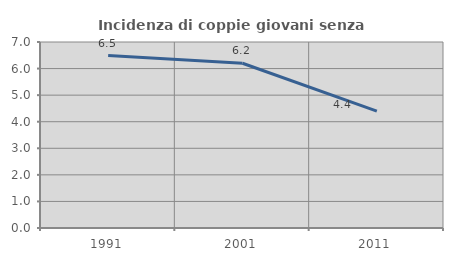
| Category | Incidenza di coppie giovani senza figli |
|---|---|
| 1991.0 | 6.488 |
| 2001.0 | 6.202 |
| 2011.0 | 4.399 |